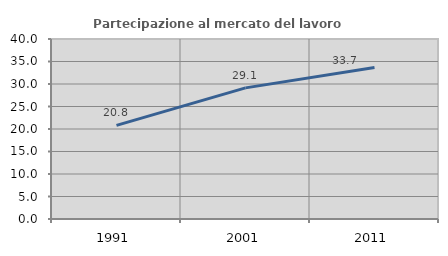
| Category | Partecipazione al mercato del lavoro  femminile |
|---|---|
| 1991.0 | 20.795 |
| 2001.0 | 29.141 |
| 2011.0 | 33.657 |